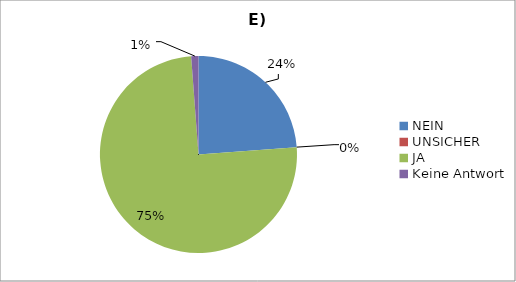
| Category | Series 0 |
|---|---|
| NEIN | 20 |
| UNSICHER | 0 |
| JA | 63 |
| Keine Antwort | 1 |